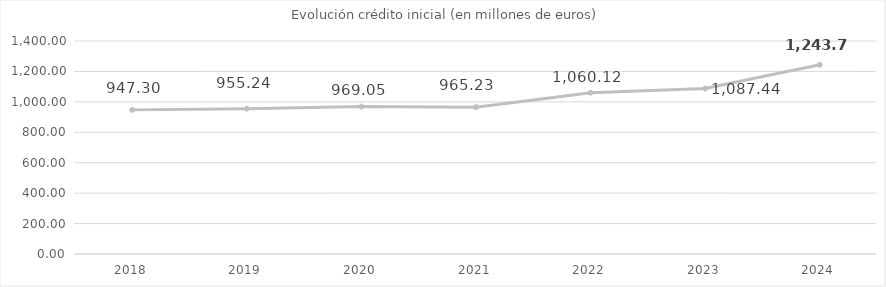
| Category | Presupuesto inicial (en millones de euros) |
|---|---|
| 2018.0 | 947.3 |
| 2019.0 | 955.238 |
| 2020.0 | 969.045 |
| 2021.0 | 965.234 |
| 2022.0 | 1060.12 |
| 2023.0 | 1087.435 |
| 2024.0 | 1243.776 |